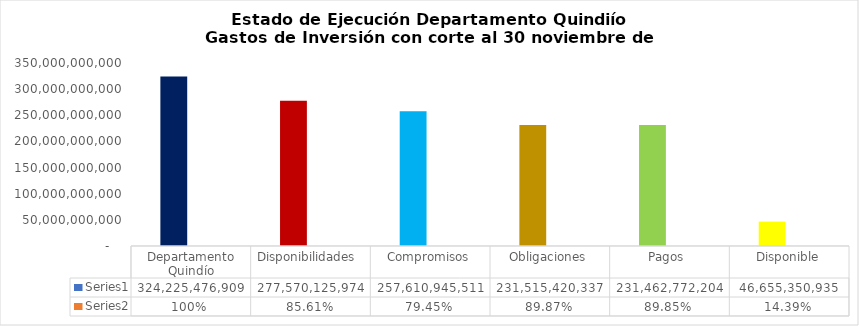
| Category | Series 0 | Series 1 |
|---|---|---|
| Departamento Quindío | 324225476909.1 | 1 |
| Disponibilidades  | 277570125974.304 | 0.856 |
| Compromisos | 257610945510.58 | 0.795 |
| Obligaciones | 231515420336.75 | 0.899 |
| Pagos  | 231462772203.75 | 0.898 |
|  Disponible  | 46655350934.796 | 0.144 |